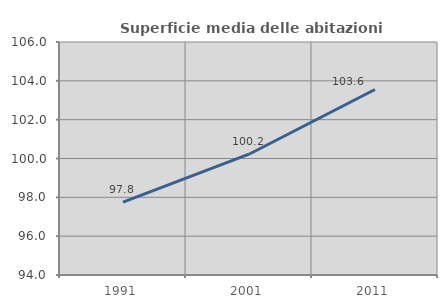
| Category | Superficie media delle abitazioni occupate |
|---|---|
| 1991.0 | 97.752 |
| 2001.0 | 100.22 |
| 2011.0 | 103.554 |